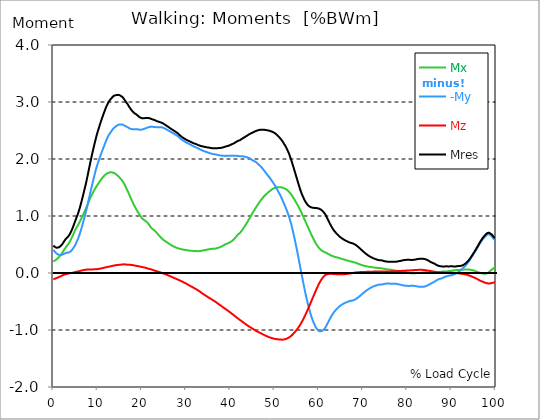
| Category |  Mx |  -My |  Mz |  Mres |
|---|---|---|---|---|
| 0.0 | 0.2 | 0.408 | -0.111 | 0.483 |
| 0.167348456675344 | 0.209 | 0.392 | -0.106 | 0.471 |
| 0.334696913350688 | 0.219 | 0.374 | -0.101 | 0.458 |
| 0.5020453700260321 | 0.227 | 0.359 | -0.096 | 0.449 |
| 0.669393826701376 | 0.237 | 0.346 | -0.09 | 0.444 |
| 0.83674228337672 | 0.246 | 0.334 | -0.085 | 0.443 |
| 1.0040907400520642 | 0.259 | 0.327 | -0.08 | 0.446 |
| 1.1621420602454444 | 0.272 | 0.321 | -0.074 | 0.448 |
| 1.3294905169207885 | 0.286 | 0.316 | -0.069 | 0.453 |
| 1.4968389735961325 | 0.301 | 0.316 | -0.062 | 0.464 |
| 1.6641874302714765 | 0.317 | 0.316 | -0.056 | 0.476 |
| 1.8315358869468206 | 0.334 | 0.317 | -0.051 | 0.489 |
| 1.9988843436221646 | 0.352 | 0.322 | -0.045 | 0.505 |
| 2.1662328002975086 | 0.374 | 0.327 | -0.039 | 0.523 |
| 2.333581256972853 | 0.395 | 0.333 | -0.033 | 0.544 |
| 2.5009297136481967 | 0.415 | 0.34 | -0.028 | 0.564 |
| 2.6682781703235405 | 0.434 | 0.346 | -0.023 | 0.583 |
| 2.8356266269988843 | 0.452 | 0.352 | -0.02 | 0.599 |
| 3.002975083674229 | 0.469 | 0.356 | -0.017 | 0.614 |
| 3.1703235403495724 | 0.486 | 0.358 | -0.013 | 0.626 |
| 3.337671997024917 | 0.502 | 0.358 | -0.01 | 0.638 |
| 3.4957233172182973 | 0.522 | 0.362 | -0.006 | 0.655 |
| 3.663071773893641 | 0.542 | 0.366 | -0.004 | 0.674 |
| 3.8304202305689854 | 0.567 | 0.377 | -0.001 | 0.699 |
| 3.997768687244329 | 0.592 | 0.387 | 0 | 0.725 |
| 4.165117143919673 | 0.619 | 0.401 | 0.002 | 0.755 |
| 4.332465600595017 | 0.648 | 0.416 | 0.004 | 0.786 |
| 4.499814057270361 | 0.676 | 0.435 | 0.007 | 0.82 |
| 4.667162513945706 | 0.706 | 0.456 | 0.011 | 0.856 |
| 4.834510970621049 | 0.735 | 0.477 | 0.014 | 0.891 |
| 5.001859427296393 | 0.762 | 0.501 | 0.018 | 0.926 |
| 5.169207883971737 | 0.787 | 0.529 | 0.021 | 0.96 |
| 5.336556340647081 | 0.809 | 0.557 | 0.023 | 0.994 |
| 5.503904797322425 | 0.831 | 0.586 | 0.027 | 1.028 |
| 5.671253253997769 | 0.854 | 0.619 | 0.029 | 1.065 |
| 5.82930457419115 | 0.878 | 0.656 | 0.032 | 1.106 |
| 5.996653030866494 | 0.904 | 0.694 | 0.035 | 1.15 |
| 6.164001487541838 | 0.931 | 0.736 | 0.038 | 1.196 |
| 6.331349944217181 | 0.958 | 0.778 | 0.042 | 1.245 |
| 6.498698400892526 | 0.986 | 0.823 | 0.046 | 1.295 |
| 6.66604685756787 | 1.014 | 0.87 | 0.049 | 1.347 |
| 6.833395314243213 | 1.041 | 0.919 | 0.05 | 1.399 |
| 7.000743770918558 | 1.069 | 0.968 | 0.053 | 1.453 |
| 7.168092227593902 | 1.098 | 1.017 | 0.055 | 1.506 |
| 7.335440684269246 | 1.127 | 1.066 | 0.057 | 1.561 |
| 7.50278914094459 | 1.158 | 1.118 | 0.058 | 1.619 |
| 7.6701375976199335 | 1.189 | 1.173 | 0.061 | 1.679 |
| 7.837486054295278 | 1.22 | 1.231 | 0.061 | 1.743 |
| 7.995537374488658 | 1.253 | 1.29 | 0.062 | 1.808 |
| 8.162885831164003 | 1.283 | 1.346 | 0.063 | 1.869 |
| 8.330234287839346 | 1.313 | 1.404 | 0.063 | 1.932 |
| 8.49758274451469 | 1.341 | 1.459 | 0.063 | 1.99 |
| 8.664931201190035 | 1.367 | 1.515 | 0.063 | 2.05 |
| 8.832279657865378 | 1.394 | 1.57 | 0.064 | 2.108 |
| 8.999628114540721 | 1.418 | 1.623 | 0.064 | 2.165 |
| 9.166976571216066 | 1.443 | 1.676 | 0.064 | 2.221 |
| 9.334325027891412 | 1.466 | 1.727 | 0.064 | 2.275 |
| 9.501673484566755 | 1.488 | 1.778 | 0.065 | 2.328 |
| 9.669021941242098 | 1.51 | 1.827 | 0.066 | 2.38 |
| 9.836370397917442 | 1.531 | 1.872 | 0.068 | 2.428 |
| 10.003718854592787 | 1.55 | 1.913 | 0.069 | 2.472 |
| 10.17106731126813 | 1.569 | 1.951 | 0.071 | 2.515 |
| 10.329118631461512 | 1.589 | 1.988 | 0.073 | 2.555 |
| 10.496467088136853 | 1.608 | 2.027 | 0.075 | 2.598 |
| 10.663815544812199 | 1.626 | 2.064 | 0.077 | 2.638 |
| 10.831164001487544 | 1.644 | 2.099 | 0.081 | 2.676 |
| 10.998512458162887 | 1.66 | 2.134 | 0.084 | 2.714 |
| 11.16586091483823 | 1.676 | 2.168 | 0.086 | 2.752 |
| 11.333209371513574 | 1.691 | 2.202 | 0.089 | 2.788 |
| 11.50055782818892 | 1.706 | 2.236 | 0.092 | 2.823 |
| 11.667906284864264 | 1.719 | 2.269 | 0.096 | 2.857 |
| 11.835254741539607 | 1.73 | 2.303 | 0.099 | 2.892 |
| 12.00260319821495 | 1.739 | 2.334 | 0.102 | 2.923 |
| 12.169951654890292 | 1.746 | 2.363 | 0.105 | 2.95 |
| 12.337300111565641 | 1.753 | 2.391 | 0.108 | 2.977 |
| 12.504648568240984 | 1.759 | 2.416 | 0.11 | 3.001 |
| 12.662699888434362 | 1.764 | 2.437 | 0.113 | 3.021 |
| 12.830048345109708 | 1.768 | 2.454 | 0.116 | 3.038 |
| 12.997396801785053 | 1.769 | 2.473 | 0.118 | 3.054 |
| 13.164745258460396 | 1.768 | 2.493 | 0.121 | 3.069 |
| 13.33209371513574 | 1.762 | 2.512 | 0.124 | 3.083 |
| 13.499442171811083 | 1.759 | 2.53 | 0.127 | 3.097 |
| 13.666790628486426 | 1.756 | 2.546 | 0.131 | 3.108 |
| 13.834139085161771 | 1.752 | 2.553 | 0.133 | 3.111 |
| 14.001487541837117 | 1.743 | 2.564 | 0.136 | 3.117 |
| 14.16883599851246 | 1.731 | 2.575 | 0.137 | 3.121 |
| 14.336184455187803 | 1.721 | 2.584 | 0.139 | 3.123 |
| 14.503532911863147 | 1.711 | 2.591 | 0.14 | 3.124 |
| 14.670881368538492 | 1.701 | 2.599 | 0.142 | 3.125 |
| 14.828932688731873 | 1.687 | 2.605 | 0.143 | 3.123 |
| 14.996281145407215 | 1.672 | 2.607 | 0.144 | 3.119 |
| 15.163629602082558 | 1.657 | 2.607 | 0.146 | 3.11 |
| 15.330978058757903 | 1.641 | 2.607 | 0.148 | 3.102 |
| 15.498326515433247 | 1.627 | 2.607 | 0.149 | 3.094 |
| 15.665674972108594 | 1.61 | 2.605 | 0.151 | 3.085 |
| 15.833023428783937 | 1.59 | 2.598 | 0.152 | 3.068 |
| 16.00037188545928 | 1.567 | 2.589 | 0.152 | 3.049 |
| 16.167720342134626 | 1.539 | 2.583 | 0.151 | 3.03 |
| 16.335068798809967 | 1.513 | 2.575 | 0.151 | 3.011 |
| 16.502417255485312 | 1.485 | 2.569 | 0.149 | 2.992 |
| 16.669765712160658 | 1.458 | 2.563 | 0.146 | 2.975 |
| 16.837114168836 | 1.431 | 2.557 | 0.145 | 2.958 |
| 17.004462625511344 | 1.404 | 2.546 | 0.144 | 2.934 |
| 17.16251394570472 | 1.376 | 2.538 | 0.144 | 2.913 |
| 17.32986240238007 | 1.344 | 2.535 | 0.143 | 2.895 |
| 17.497210859055414 | 1.314 | 2.529 | 0.142 | 2.874 |
| 17.664559315730756 | 1.288 | 2.525 | 0.141 | 2.859 |
| 17.8319077724061 | 1.26 | 2.522 | 0.139 | 2.842 |
| 17.999256229081443 | 1.231 | 2.521 | 0.137 | 2.828 |
| 18.166604685756788 | 1.203 | 2.52 | 0.135 | 2.814 |
| 18.333953142432133 | 1.177 | 2.521 | 0.132 | 2.804 |
| 18.501301599107478 | 1.153 | 2.522 | 0.128 | 2.795 |
| 18.668650055782823 | 1.13 | 2.523 | 0.126 | 2.787 |
| 18.835998512458165 | 1.107 | 2.524 | 0.123 | 2.778 |
| 19.00334696913351 | 1.083 | 2.523 | 0.122 | 2.766 |
| 19.170695425808855 | 1.061 | 2.52 | 0.119 | 2.755 |
| 19.338043882484197 | 1.042 | 2.515 | 0.117 | 2.743 |
| 19.496095202677576 | 1.023 | 2.512 | 0.115 | 2.732 |
| 19.66344365935292 | 1.003 | 2.51 | 0.111 | 2.722 |
| 19.830792116028263 | 0.984 | 2.515 | 0.109 | 2.721 |
| 19.998140572703612 | 0.965 | 2.514 | 0.106 | 2.713 |
| 20.165489029378953 | 0.951 | 2.519 | 0.103 | 2.714 |
| 20.3328374860543 | 0.939 | 2.523 | 0.1 | 2.715 |
| 20.500185942729644 | 0.93 | 2.528 | 0.097 | 2.715 |
| 20.667534399404985 | 0.921 | 2.532 | 0.094 | 2.717 |
| 20.83488285608033 | 0.913 | 2.537 | 0.091 | 2.719 |
| 21.002231312755672 | 0.902 | 2.542 | 0.088 | 2.72 |
| 21.16957976943102 | 0.891 | 2.549 | 0.084 | 2.722 |
| 21.336928226106362 | 0.879 | 2.553 | 0.08 | 2.723 |
| 21.504276682781704 | 0.864 | 2.556 | 0.075 | 2.72 |
| 21.67162513945705 | 0.845 | 2.561 | 0.072 | 2.715 |
| 21.82967645965043 | 0.826 | 2.565 | 0.068 | 2.712 |
| 21.997024916325774 | 0.806 | 2.567 | 0.066 | 2.707 |
| 22.16437337300112 | 0.79 | 2.568 | 0.062 | 2.703 |
| 22.33172182967646 | 0.777 | 2.567 | 0.057 | 2.697 |
| 22.499070286351806 | 0.766 | 2.564 | 0.054 | 2.692 |
| 22.666418743027148 | 0.758 | 2.563 | 0.049 | 2.689 |
| 22.833767199702496 | 0.747 | 2.563 | 0.044 | 2.686 |
| 23.00111565637784 | 0.737 | 2.559 | 0.039 | 2.679 |
| 23.168464113053183 | 0.723 | 2.558 | 0.035 | 2.673 |
| 23.335812569728528 | 0.708 | 2.557 | 0.032 | 2.668 |
| 23.50316102640387 | 0.693 | 2.555 | 0.028 | 2.661 |
| 23.670509483079215 | 0.678 | 2.554 | 0.023 | 2.655 |
| 23.83785793975456 | 0.663 | 2.556 | 0.02 | 2.653 |
| 23.995909259947936 | 0.649 | 2.557 | 0.016 | 2.65 |
| 24.163257716623285 | 0.636 | 2.556 | 0.012 | 2.644 |
| 24.330606173298627 | 0.621 | 2.556 | 0.007 | 2.64 |
| 24.49795462997397 | 0.607 | 2.556 | 0.003 | 2.636 |
| 24.665303086649313 | 0.596 | 2.553 | -0.002 | 2.63 |
| 24.83265154332466 | 0.585 | 2.549 | -0.006 | 2.623 |
| 25.0 | 0.574 | 2.541 | -0.012 | 2.614 |
| 25.167348456675345 | 0.564 | 2.536 | -0.017 | 2.606 |
| 25.334696913350694 | 0.555 | 2.529 | -0.021 | 2.597 |
| 25.502045370026035 | 0.547 | 2.522 | -0.027 | 2.588 |
| 25.669393826701377 | 0.539 | 2.514 | -0.031 | 2.58 |
| 25.836742283376722 | 0.531 | 2.507 | -0.036 | 2.571 |
| 26.004090740052067 | 0.521 | 2.501 | -0.042 | 2.563 |
| 26.17143919672741 | 0.512 | 2.493 | -0.048 | 2.553 |
| 26.329490516920792 | 0.503 | 2.484 | -0.053 | 2.542 |
| 26.49683897359613 | 0.495 | 2.478 | -0.059 | 2.534 |
| 26.66418743027148 | 0.487 | 2.47 | -0.065 | 2.527 |
| 26.831535886946828 | 0.48 | 2.464 | -0.07 | 2.518 |
| 26.998884343622166 | 0.473 | 2.456 | -0.076 | 2.511 |
| 27.166232800297514 | 0.466 | 2.449 | -0.082 | 2.502 |
| 27.333581256972852 | 0.461 | 2.441 | -0.088 | 2.493 |
| 27.5009297136482 | 0.455 | 2.432 | -0.093 | 2.484 |
| 27.668278170323543 | 0.449 | 2.424 | -0.099 | 2.475 |
| 27.835626626998888 | 0.444 | 2.417 | -0.105 | 2.467 |
| 28.002975083674233 | 0.438 | 2.41 | -0.11 | 2.459 |
| 28.170323540349575 | 0.434 | 2.4 | -0.116 | 2.449 |
| 28.33767199702492 | 0.43 | 2.39 | -0.122 | 2.437 |
| 28.50502045370026 | 0.426 | 2.375 | -0.127 | 2.424 |
| 28.663071773893645 | 0.424 | 2.363 | -0.133 | 2.411 |
| 28.830420230568986 | 0.419 | 2.351 | -0.139 | 2.4 |
| 28.99776868724433 | 0.416 | 2.342 | -0.145 | 2.39 |
| 29.165117143919673 | 0.414 | 2.333 | -0.152 | 2.381 |
| 29.33246560059502 | 0.411 | 2.325 | -0.158 | 2.373 |
| 29.499814057270367 | 0.408 | 2.315 | -0.165 | 2.364 |
| 29.66716251394571 | 0.406 | 2.308 | -0.171 | 2.356 |
| 29.834510970621054 | 0.403 | 2.299 | -0.177 | 2.348 |
| 30.00185942729639 | 0.401 | 2.292 | -0.184 | 2.341 |
| 30.169207883971744 | 0.4 | 2.285 | -0.191 | 2.333 |
| 30.33655634064708 | 0.398 | 2.277 | -0.2 | 2.326 |
| 30.50390479732243 | 0.396 | 2.271 | -0.207 | 2.321 |
| 30.671253253997772 | 0.394 | 2.265 | -0.214 | 2.315 |
| 30.829304574191156 | 0.392 | 2.259 | -0.222 | 2.31 |
| 30.996653030866494 | 0.391 | 2.253 | -0.228 | 2.303 |
| 31.164001487541842 | 0.39 | 2.245 | -0.237 | 2.296 |
| 31.331349944217187 | 0.389 | 2.237 | -0.243 | 2.29 |
| 31.498698400892525 | 0.389 | 2.229 | -0.251 | 2.283 |
| 31.666046857567874 | 0.387 | 2.223 | -0.257 | 2.278 |
| 31.833395314243212 | 0.386 | 2.218 | -0.264 | 2.273 |
| 32.00074377091856 | 0.385 | 2.212 | -0.273 | 2.269 |
| 32.1680922275939 | 0.385 | 2.207 | -0.28 | 2.264 |
| 32.33544068426925 | 0.384 | 2.201 | -0.287 | 2.259 |
| 32.50278914094459 | 0.383 | 2.194 | -0.294 | 2.254 |
| 32.670137597619934 | 0.382 | 2.188 | -0.303 | 2.248 |
| 32.83748605429528 | 0.383 | 2.18 | -0.311 | 2.242 |
| 33.004834510970625 | 0.384 | 2.174 | -0.321 | 2.237 |
| 33.162885831164004 | 0.385 | 2.168 | -0.329 | 2.232 |
| 33.33023428783935 | 0.386 | 2.161 | -0.338 | 2.228 |
| 33.497582744514695 | 0.389 | 2.156 | -0.347 | 2.225 |
| 33.664931201190036 | 0.394 | 2.151 | -0.358 | 2.222 |
| 33.83227965786538 | 0.396 | 2.145 | -0.366 | 2.22 |
| 33.99962811454073 | 0.398 | 2.141 | -0.375 | 2.217 |
| 34.16697657121607 | 0.4 | 2.135 | -0.383 | 2.213 |
| 34.33432502789141 | 0.403 | 2.13 | -0.391 | 2.21 |
| 34.50167348456676 | 0.406 | 2.125 | -0.399 | 2.208 |
| 34.6690219412421 | 0.409 | 2.12 | -0.408 | 2.205 |
| 34.83637039791744 | 0.412 | 2.117 | -0.416 | 2.204 |
| 35.00371885459279 | 0.414 | 2.113 | -0.426 | 2.203 |
| 35.17106731126814 | 0.416 | 2.108 | -0.433 | 2.2 |
| 35.338415767943474 | 0.418 | 2.104 | -0.442 | 2.197 |
| 35.49646708813686 | 0.42 | 2.1 | -0.449 | 2.195 |
| 35.6638155448122 | 0.423 | 2.096 | -0.456 | 2.193 |
| 35.831164001487544 | 0.425 | 2.091 | -0.465 | 2.19 |
| 35.998512458162885 | 0.426 | 2.088 | -0.472 | 2.189 |
| 36.165860914838234 | 0.426 | 2.086 | -0.481 | 2.188 |
| 36.333209371513576 | 0.426 | 2.084 | -0.488 | 2.189 |
| 36.50055782818892 | 0.427 | 2.082 | -0.497 | 2.188 |
| 36.667906284864266 | 0.43 | 2.08 | -0.505 | 2.189 |
| 36.83525474153961 | 0.433 | 2.077 | -0.515 | 2.189 |
| 37.002603198214956 | 0.436 | 2.073 | -0.524 | 2.189 |
| 37.1699516548903 | 0.441 | 2.071 | -0.534 | 2.19 |
| 37.337300111565646 | 0.445 | 2.069 | -0.544 | 2.191 |
| 37.50464856824098 | 0.449 | 2.066 | -0.552 | 2.192 |
| 37.66269988843437 | 0.453 | 2.064 | -0.562 | 2.193 |
| 37.83004834510971 | 0.458 | 2.062 | -0.57 | 2.194 |
| 37.99739680178505 | 0.464 | 2.059 | -0.58 | 2.196 |
| 38.16474525846039 | 0.47 | 2.057 | -0.59 | 2.2 |
| 38.33209371513574 | 0.478 | 2.056 | -0.6 | 2.203 |
| 38.49944217181109 | 0.486 | 2.055 | -0.608 | 2.207 |
| 38.666790628486424 | 0.494 | 2.055 | -0.618 | 2.211 |
| 38.83413908516178 | 0.5 | 2.054 | -0.627 | 2.215 |
| 39.001487541837115 | 0.507 | 2.054 | -0.636 | 2.22 |
| 39.16883599851246 | 0.512 | 2.056 | -0.645 | 2.224 |
| 39.336184455187805 | 0.517 | 2.055 | -0.654 | 2.227 |
| 39.503532911863154 | 0.522 | 2.055 | -0.663 | 2.23 |
| 39.670881368538495 | 0.529 | 2.054 | -0.673 | 2.235 |
| 39.83822982521384 | 0.535 | 2.056 | -0.683 | 2.24 |
| 39.996281145407224 | 0.541 | 2.057 | -0.692 | 2.246 |
| 40.163629602082565 | 0.549 | 2.057 | -0.703 | 2.252 |
| 40.33097805875791 | 0.558 | 2.057 | -0.713 | 2.258 |
| 40.498326515433256 | 0.569 | 2.059 | -0.723 | 2.264 |
| 40.6656749721086 | 0.58 | 2.059 | -0.732 | 2.271 |
| 40.83302342878393 | 0.592 | 2.057 | -0.743 | 2.276 |
| 41.00037188545929 | 0.606 | 2.057 | -0.754 | 2.283 |
| 41.16772034213463 | 0.621 | 2.057 | -0.764 | 2.291 |
| 41.33506879880997 | 0.638 | 2.056 | -0.774 | 2.299 |
| 41.50241725548531 | 0.655 | 2.055 | -0.783 | 2.308 |
| 41.66976571216066 | 0.669 | 2.054 | -0.794 | 2.314 |
| 41.837114168836 | 0.682 | 2.052 | -0.804 | 2.321 |
| 42.004462625511344 | 0.692 | 2.051 | -0.813 | 2.325 |
| 42.17181108218669 | 0.703 | 2.049 | -0.823 | 2.33 |
| 42.32986240238007 | 0.717 | 2.048 | -0.832 | 2.337 |
| 42.497210859055414 | 0.734 | 2.048 | -0.842 | 2.346 |
| 42.66455931573076 | 0.752 | 2.049 | -0.851 | 2.356 |
| 42.831907772406105 | 0.771 | 2.048 | -0.861 | 2.364 |
| 42.999256229081446 | 0.789 | 2.046 | -0.87 | 2.372 |
| 43.16660468575679 | 0.808 | 2.044 | -0.88 | 2.379 |
| 43.33395314243214 | 0.827 | 2.041 | -0.89 | 2.387 |
| 43.50130159910748 | 0.847 | 2.037 | -0.899 | 2.395 |
| 43.66865005578282 | 0.868 | 2.034 | -0.908 | 2.403 |
| 43.83599851245817 | 0.89 | 2.029 | -0.916 | 2.411 |
| 44.00334696913351 | 0.912 | 2.023 | -0.926 | 2.419 |
| 44.17069542580886 | 0.935 | 2.019 | -0.934 | 2.428 |
| 44.3380438824842 | 0.958 | 2.014 | -0.943 | 2.436 |
| 44.49609520267758 | 0.98 | 2.007 | -0.951 | 2.444 |
| 44.66344365935292 | 1.002 | 1.998 | -0.959 | 2.449 |
| 44.83079211602827 | 1.025 | 1.987 | -0.966 | 2.454 |
| 44.99814057270361 | 1.049 | 1.979 | -0.975 | 2.462 |
| 45.16548902937895 | 1.069 | 1.972 | -0.982 | 2.468 |
| 45.332837486054295 | 1.09 | 1.967 | -0.99 | 2.475 |
| 45.500185942729644 | 1.111 | 1.961 | -0.999 | 2.481 |
| 45.66753439940499 | 1.133 | 1.952 | -1.007 | 2.487 |
| 45.83488285608033 | 1.152 | 1.944 | -1.015 | 2.493 |
| 46.00223131275568 | 1.172 | 1.933 | -1.022 | 2.497 |
| 46.16957976943102 | 1.193 | 1.921 | -1.03 | 2.502 |
| 46.336928226106366 | 1.213 | 1.91 | -1.036 | 2.505 |
| 46.50427668278171 | 1.231 | 1.897 | -1.044 | 2.508 |
| 46.671625139457056 | 1.251 | 1.885 | -1.049 | 2.511 |
| 46.829676459650436 | 1.269 | 1.874 | -1.055 | 2.514 |
| 46.99702491632577 | 1.285 | 1.861 | -1.062 | 2.515 |
| 47.16437337300112 | 1.3 | 1.845 | -1.069 | 2.515 |
| 47.33172182967646 | 1.317 | 1.829 | -1.075 | 2.515 |
| 47.49907028635181 | 1.334 | 1.812 | -1.082 | 2.515 |
| 47.66641874302716 | 1.348 | 1.795 | -1.088 | 2.513 |
| 47.83376719970249 | 1.361 | 1.778 | -1.094 | 2.511 |
| 48.001115656377834 | 1.374 | 1.761 | -1.1 | 2.508 |
| 48.16846411305319 | 1.385 | 1.744 | -1.106 | 2.506 |
| 48.33581256972853 | 1.398 | 1.727 | -1.111 | 2.503 |
| 48.50316102640387 | 1.41 | 1.71 | -1.117 | 2.501 |
| 48.67050948307921 | 1.421 | 1.695 | -1.122 | 2.499 |
| 48.837857939754564 | 1.431 | 1.68 | -1.128 | 2.496 |
| 49.005206396429905 | 1.441 | 1.662 | -1.133 | 2.492 |
| 49.163257716623285 | 1.45 | 1.644 | -1.137 | 2.487 |
| 49.33060617329863 | 1.463 | 1.625 | -1.14 | 2.484 |
| 49.49795462997397 | 1.472 | 1.605 | -1.144 | 2.479 |
| 49.66530308664932 | 1.48 | 1.585 | -1.148 | 2.472 |
| 49.832651543324666 | 1.485 | 1.567 | -1.15 | 2.465 |
| 50.0 | 1.489 | 1.547 | -1.154 | 2.456 |
| 50.16734845667534 | 1.496 | 1.527 | -1.157 | 2.449 |
| 50.33469691335069 | 1.499 | 1.504 | -1.159 | 2.438 |
| 50.50204537002604 | 1.501 | 1.481 | -1.161 | 2.427 |
| 50.66939382670139 | 1.503 | 1.458 | -1.162 | 2.414 |
| 50.836742283376715 | 1.504 | 1.432 | -1.163 | 2.401 |
| 51.00409074005207 | 1.505 | 1.408 | -1.166 | 2.387 |
| 51.17143919672741 | 1.504 | 1.383 | -1.167 | 2.374 |
| 51.32949051692079 | 1.504 | 1.358 | -1.168 | 2.359 |
| 51.496838973596134 | 1.503 | 1.331 | -1.169 | 2.343 |
| 51.66418743027148 | 1.5 | 1.305 | -1.17 | 2.327 |
| 51.831535886946824 | 1.497 | 1.274 | -1.17 | 2.307 |
| 51.99888434362217 | 1.492 | 1.244 | -1.168 | 2.287 |
| 52.16623280029752 | 1.486 | 1.214 | -1.166 | 2.265 |
| 52.33358125697285 | 1.481 | 1.186 | -1.163 | 2.245 |
| 52.5009297136482 | 1.475 | 1.155 | -1.16 | 2.223 |
| 52.668278170323546 | 1.466 | 1.121 | -1.155 | 2.199 |
| 52.835626626998895 | 1.458 | 1.087 | -1.149 | 2.171 |
| 53.00297508367424 | 1.447 | 1.052 | -1.143 | 2.143 |
| 53.17032354034958 | 1.434 | 1.016 | -1.136 | 2.114 |
| 53.33767199702492 | 1.42 | 0.978 | -1.128 | 2.083 |
| 53.50502045370027 | 1.406 | 0.932 | -1.12 | 2.046 |
| 53.663071773893655 | 1.389 | 0.886 | -1.11 | 2.008 |
| 53.83042023056899 | 1.372 | 0.84 | -1.1 | 1.971 |
| 53.99776868724433 | 1.351 | 0.788 | -1.087 | 1.929 |
| 54.16511714391967 | 1.331 | 0.732 | -1.073 | 1.887 |
| 54.33246560059503 | 1.31 | 0.674 | -1.059 | 1.846 |
| 54.49981405727037 | 1.29 | 0.616 | -1.046 | 1.803 |
| 54.667162513945705 | 1.269 | 0.555 | -1.03 | 1.759 |
| 54.834510970621054 | 1.246 | 0.495 | -1.015 | 1.715 |
| 55.0018594272964 | 1.224 | 0.432 | -0.999 | 1.672 |
| 55.169207883971744 | 1.201 | 0.367 | -0.982 | 1.628 |
| 55.336556340647086 | 1.176 | 0.3 | -0.965 | 1.584 |
| 55.50390479732243 | 1.151 | 0.232 | -0.946 | 1.542 |
| 55.671253253997776 | 1.126 | 0.163 | -0.926 | 1.5 |
| 55.83860171067312 | 1.1 | 0.096 | -0.904 | 1.46 |
| 55.9966530308665 | 1.073 | 0.029 | -0.882 | 1.423 |
| 56.16400148754184 | 1.046 | -0.037 | -0.86 | 1.389 |
| 56.33134994421718 | 1.018 | -0.103 | -0.835 | 1.358 |
| 56.498698400892536 | 0.99 | -0.169 | -0.811 | 1.329 |
| 56.66604685756788 | 0.962 | -0.234 | -0.786 | 1.3 |
| 56.83339531424321 | 0.933 | -0.297 | -0.759 | 1.274 |
| 57.00074377091856 | 0.903 | -0.36 | -0.731 | 1.251 |
| 57.16809222759391 | 0.874 | -0.418 | -0.704 | 1.23 |
| 57.33544068426925 | 0.844 | -0.472 | -0.675 | 1.211 |
| 57.5027891409446 | 0.814 | -0.527 | -0.646 | 1.194 |
| 57.670137597619934 | 0.786 | -0.58 | -0.618 | 1.182 |
| 57.83748605429528 | 0.756 | -0.628 | -0.587 | 1.172 |
| 58.004834510970625 | 0.728 | -0.675 | -0.556 | 1.162 |
| 58.16288583116401 | 0.701 | -0.72 | -0.525 | 1.157 |
| 58.330234287839346 | 0.673 | -0.762 | -0.494 | 1.152 |
| 58.497582744514695 | 0.646 | -0.8 | -0.463 | 1.146 |
| 58.66493120119004 | 0.62 | -0.835 | -0.433 | 1.143 |
| 58.832279657865385 | 0.594 | -0.868 | -0.402 | 1.143 |
| 58.999628114540734 | 0.57 | -0.898 | -0.372 | 1.142 |
| 59.16697657121607 | 0.546 | -0.926 | -0.342 | 1.142 |
| 59.33432502789142 | 0.522 | -0.951 | -0.311 | 1.141 |
| 59.50167348456676 | 0.5 | -0.972 | -0.281 | 1.14 |
| 59.66902194124211 | 0.48 | -0.989 | -0.253 | 1.137 |
| 59.83637039791745 | 0.463 | -1.003 | -0.226 | 1.135 |
| 60.00371885459278 | 0.446 | -1.014 | -0.2 | 1.132 |
| 60.17106731126813 | 0.43 | -1.021 | -0.174 | 1.127 |
| 60.33841576794349 | 0.416 | -1.024 | -0.15 | 1.12 |
| 60.49646708813685 | 0.404 | -1.023 | -0.128 | 1.111 |
| 60.6638155448122 | 0.395 | -1.019 | -0.108 | 1.102 |
| 60.831164001487544 | 0.386 | -1.012 | -0.09 | 1.089 |
| 60.99851245816289 | 0.379 | -1.002 | -0.073 | 1.076 |
| 61.16586091483824 | 0.373 | -0.992 | -0.057 | 1.063 |
| 61.333209371513576 | 0.366 | -0.978 | -0.045 | 1.047 |
| 61.50055782818892 | 0.36 | -0.959 | -0.035 | 1.025 |
| 61.667906284864266 | 0.354 | -0.933 | -0.03 | 1 |
| 61.835254741539615 | 0.347 | -0.91 | -0.023 | 0.975 |
| 62.002603198214956 | 0.341 | -0.885 | -0.02 | 0.949 |
| 62.16995165489029 | 0.333 | -0.86 | -0.018 | 0.923 |
| 62.33730011156564 | 0.326 | -0.833 | -0.016 | 0.896 |
| 62.504648568240995 | 0.318 | -0.809 | -0.015 | 0.869 |
| 62.67199702491633 | 0.312 | -0.785 | -0.014 | 0.845 |
| 62.83004834510971 | 0.306 | -0.761 | -0.015 | 0.821 |
| 62.99739680178505 | 0.301 | -0.74 | -0.015 | 0.799 |
| 63.1647452584604 | 0.296 | -0.719 | -0.016 | 0.778 |
| 63.33209371513575 | 0.291 | -0.7 | -0.016 | 0.758 |
| 63.4994421718111 | 0.287 | -0.682 | -0.017 | 0.74 |
| 63.666790628486424 | 0.282 | -0.667 | -0.018 | 0.724 |
| 63.83413908516177 | 0.279 | -0.651 | -0.02 | 0.709 |
| 64.00148754183712 | 0.276 | -0.636 | -0.021 | 0.693 |
| 64.16883599851248 | 0.272 | -0.623 | -0.021 | 0.68 |
| 64.3361844551878 | 0.269 | -0.61 | -0.022 | 0.668 |
| 64.50353291186315 | 0.264 | -0.599 | -0.023 | 0.655 |
| 64.6708813685385 | 0.261 | -0.587 | -0.023 | 0.643 |
| 64.83822982521384 | 0.257 | -0.576 | -0.023 | 0.632 |
| 65.00557828188919 | 0.253 | -0.567 | -0.023 | 0.621 |
| 65.16362960208257 | 0.249 | -0.558 | -0.023 | 0.613 |
| 65.3309780587579 | 0.245 | -0.55 | -0.022 | 0.603 |
| 65.49832651543326 | 0.242 | -0.542 | -0.022 | 0.594 |
| 65.6656749721086 | 0.238 | -0.536 | -0.021 | 0.587 |
| 65.83302342878395 | 0.234 | -0.529 | -0.021 | 0.579 |
| 66.00037188545929 | 0.229 | -0.523 | -0.019 | 0.571 |
| 66.16772034213463 | 0.225 | -0.518 | -0.018 | 0.565 |
| 66.33506879880998 | 0.222 | -0.512 | -0.016 | 0.558 |
| 66.50241725548531 | 0.218 | -0.506 | -0.015 | 0.552 |
| 66.66976571216065 | 0.214 | -0.502 | -0.013 | 0.546 |
| 66.83711416883601 | 0.21 | -0.497 | -0.011 | 0.54 |
| 67.00446262551135 | 0.207 | -0.493 | -0.008 | 0.535 |
| 67.1718110821867 | 0.204 | -0.488 | -0.006 | 0.53 |
| 67.32986240238007 | 0.201 | -0.486 | -0.003 | 0.527 |
| 67.49721085905541 | 0.199 | -0.485 | -0.001 | 0.524 |
| 67.66455931573076 | 0.195 | -0.482 | 0.001 | 0.52 |
| 67.83190777240611 | 0.191 | -0.478 | 0.003 | 0.515 |
| 67.99925622908145 | 0.188 | -0.472 | 0.005 | 0.508 |
| 68.16660468575678 | 0.184 | -0.467 | 0.007 | 0.502 |
| 68.33395314243214 | 0.179 | -0.46 | 0.008 | 0.495 |
| 68.50130159910749 | 0.175 | -0.452 | 0.011 | 0.485 |
| 68.66865005578282 | 0.17 | -0.443 | 0.012 | 0.476 |
| 68.83599851245816 | 0.165 | -0.433 | 0.013 | 0.464 |
| 69.00334696913352 | 0.16 | -0.424 | 0.014 | 0.453 |
| 69.17069542580886 | 0.155 | -0.413 | 0.015 | 0.442 |
| 69.3380438824842 | 0.15 | -0.401 | 0.016 | 0.43 |
| 69.50539233915956 | 0.145 | -0.391 | 0.016 | 0.417 |
| 69.66344365935292 | 0.141 | -0.379 | 0.017 | 0.406 |
| 69.83079211602826 | 0.137 | -0.368 | 0.017 | 0.394 |
| 69.99814057270362 | 0.134 | -0.357 | 0.018 | 0.382 |
| 70.16548902937896 | 0.13 | -0.346 | 0.018 | 0.37 |
| 70.33283748605429 | 0.126 | -0.335 | 0.019 | 0.359 |
| 70.50018594272964 | 0.123 | -0.324 | 0.019 | 0.348 |
| 70.667534399405 | 0.12 | -0.314 | 0.02 | 0.338 |
| 70.83488285608033 | 0.118 | -0.305 | 0.02 | 0.328 |
| 71.00223131275568 | 0.115 | -0.295 | 0.02 | 0.317 |
| 71.16957976943102 | 0.111 | -0.287 | 0.021 | 0.309 |
| 71.33692822610637 | 0.109 | -0.277 | 0.021 | 0.299 |
| 71.50427668278171 | 0.107 | -0.271 | 0.021 | 0.293 |
| 71.67162513945706 | 0.105 | -0.263 | 0.022 | 0.286 |
| 71.8389735961324 | 0.103 | -0.256 | 0.022 | 0.277 |
| 71.99702491632577 | 0.102 | -0.248 | 0.023 | 0.271 |
| 72.16437337300113 | 0.1 | -0.242 | 0.023 | 0.264 |
| 72.33172182967647 | 0.099 | -0.237 | 0.024 | 0.259 |
| 72.49907028635181 | 0.097 | -0.232 | 0.025 | 0.254 |
| 72.66641874302715 | 0.096 | -0.227 | 0.025 | 0.249 |
| 72.8337671997025 | 0.093 | -0.223 | 0.025 | 0.244 |
| 73.00111565637783 | 0.091 | -0.218 | 0.025 | 0.239 |
| 73.16846411305319 | 0.09 | -0.213 | 0.025 | 0.235 |
| 73.33581256972853 | 0.089 | -0.209 | 0.025 | 0.23 |
| 73.50316102640387 | 0.088 | -0.206 | 0.025 | 0.227 |
| 73.67050948307921 | 0.087 | -0.204 | 0.027 | 0.224 |
| 73.83785793975457 | 0.086 | -0.203 | 0.027 | 0.224 |
| 74.00520639642991 | 0.085 | -0.203 | 0.028 | 0.223 |
| 74.16325771662328 | 0.083 | -0.203 | 0.028 | 0.222 |
| 74.33060617329863 | 0.081 | -0.201 | 0.027 | 0.22 |
| 74.49795462997398 | 0.079 | -0.199 | 0.028 | 0.217 |
| 74.66530308664932 | 0.076 | -0.195 | 0.028 | 0.213 |
| 74.83265154332466 | 0.073 | -0.191 | 0.028 | 0.208 |
| 75.00000000000001 | 0.07 | -0.188 | 0.028 | 0.205 |
| 75.16734845667534 | 0.068 | -0.187 | 0.028 | 0.203 |
| 75.3346969133507 | 0.066 | -0.186 | 0.028 | 0.201 |
| 75.50204537002605 | 0.064 | -0.186 | 0.028 | 0.2 |
| 75.66939382670138 | 0.063 | -0.185 | 0.028 | 0.199 |
| 75.83674228337672 | 0.061 | -0.185 | 0.028 | 0.199 |
| 76.00409074005208 | 0.059 | -0.186 | 0.029 | 0.199 |
| 76.17143919672742 | 0.058 | -0.187 | 0.029 | 0.2 |
| 76.33878765340276 | 0.056 | -0.187 | 0.029 | 0.199 |
| 76.49683897359614 | 0.054 | -0.187 | 0.029 | 0.199 |
| 76.66418743027148 | 0.052 | -0.187 | 0.029 | 0.197 |
| 76.83153588694682 | 0.05 | -0.187 | 0.03 | 0.197 |
| 76.99888434362218 | 0.048 | -0.188 | 0.03 | 0.197 |
| 77.16623280029752 | 0.045 | -0.187 | 0.031 | 0.197 |
| 77.33358125697285 | 0.042 | -0.188 | 0.031 | 0.197 |
| 77.5009297136482 | 0.04 | -0.189 | 0.032 | 0.197 |
| 77.66827817032356 | 0.039 | -0.192 | 0.033 | 0.201 |
| 77.83562662699889 | 0.038 | -0.195 | 0.033 | 0.203 |
| 78.00297508367423 | 0.037 | -0.197 | 0.034 | 0.206 |
| 78.17032354034959 | 0.035 | -0.201 | 0.035 | 0.208 |
| 78.33767199702493 | 0.033 | -0.203 | 0.036 | 0.21 |
| 78.50502045370027 | 0.032 | -0.206 | 0.036 | 0.212 |
| 78.67236891037561 | 0.032 | -0.209 | 0.037 | 0.217 |
| 78.83042023056899 | 0.03 | -0.212 | 0.038 | 0.22 |
| 78.99776868724433 | 0.028 | -0.215 | 0.039 | 0.222 |
| 79.16511714391969 | 0.027 | -0.218 | 0.04 | 0.224 |
| 79.33246560059503 | 0.024 | -0.22 | 0.04 | 0.226 |
| 79.49981405727036 | 0.022 | -0.223 | 0.041 | 0.228 |
| 79.66716251394571 | 0.019 | -0.225 | 0.042 | 0.23 |
| 79.83451097062107 | 0.015 | -0.225 | 0.042 | 0.23 |
| 80.00185942729641 | 0.012 | -0.225 | 0.044 | 0.23 |
| 80.16920788397174 | 0.008 | -0.226 | 0.044 | 0.23 |
| 80.33655634064709 | 0.004 | -0.226 | 0.045 | 0.231 |
| 80.50390479732243 | 0.002 | -0.226 | 0.045 | 0.231 |
| 80.67125325399778 | -0.001 | -0.225 | 0.046 | 0.23 |
| 80.83860171067312 | -0.003 | -0.224 | 0.047 | 0.229 |
| 80.99665303086651 | -0.004 | -0.224 | 0.048 | 0.229 |
| 81.16400148754184 | -0.005 | -0.223 | 0.049 | 0.229 |
| 81.3313499442172 | -0.005 | -0.224 | 0.049 | 0.23 |
| 81.49869840089255 | -0.004 | -0.225 | 0.05 | 0.231 |
| 81.66604685756786 | -0.003 | -0.227 | 0.051 | 0.234 |
| 81.83339531424322 | -0.003 | -0.228 | 0.052 | 0.236 |
| 82.00074377091858 | -0.002 | -0.23 | 0.052 | 0.238 |
| 82.16809222759392 | -0.001 | -0.234 | 0.053 | 0.241 |
| 82.33544068426926 | -0.001 | -0.237 | 0.054 | 0.244 |
| 82.50278914094459 | 0 | -0.239 | 0.055 | 0.246 |
| 82.67013759761994 | 0.001 | -0.241 | 0.055 | 0.248 |
| 82.83748605429528 | 0.003 | -0.242 | 0.056 | 0.249 |
| 83.00483451097062 | 0.003 | -0.242 | 0.056 | 0.249 |
| 83.17218296764597 | 0.005 | -0.242 | 0.056 | 0.249 |
| 83.33023428783935 | 0.006 | -0.242 | 0.055 | 0.249 |
| 83.4975827445147 | 0.007 | -0.243 | 0.055 | 0.251 |
| 83.66493120119004 | 0.008 | -0.242 | 0.054 | 0.249 |
| 83.83227965786537 | 0.011 | -0.24 | 0.052 | 0.246 |
| 83.99962811454073 | 0.011 | -0.237 | 0.051 | 0.244 |
| 84.16697657121607 | 0.012 | -0.232 | 0.049 | 0.24 |
| 84.33432502789142 | 0.012 | -0.228 | 0.047 | 0.236 |
| 84.50167348456677 | 0.012 | -0.222 | 0.045 | 0.229 |
| 84.6690219412421 | 0.011 | -0.217 | 0.042 | 0.224 |
| 84.83637039791745 | 0.011 | -0.209 | 0.04 | 0.217 |
| 85.0037188545928 | 0.011 | -0.202 | 0.038 | 0.208 |
| 85.17106731126813 | 0.01 | -0.194 | 0.036 | 0.2 |
| 85.33841576794349 | 0.011 | -0.187 | 0.033 | 0.193 |
| 85.50576422461883 | 0.011 | -0.18 | 0.031 | 0.187 |
| 85.66381554481221 | 0.01 | -0.173 | 0.029 | 0.18 |
| 85.83116400148755 | 0.01 | -0.167 | 0.027 | 0.174 |
| 85.99851245816289 | 0.008 | -0.159 | 0.024 | 0.169 |
| 86.16586091483823 | 0.008 | -0.153 | 0.022 | 0.165 |
| 86.33320937151358 | 0.008 | -0.144 | 0.02 | 0.157 |
| 86.50055782818893 | 0.007 | -0.135 | 0.018 | 0.148 |
| 86.66790628486427 | 0.008 | -0.126 | 0.016 | 0.139 |
| 86.83525474153961 | 0.011 | -0.119 | 0.014 | 0.134 |
| 87.00260319821496 | 0.012 | -0.113 | 0.013 | 0.128 |
| 87.16995165489031 | 0.014 | -0.107 | 0.012 | 0.124 |
| 87.33730011156564 | 0.016 | -0.102 | 0.012 | 0.12 |
| 87.504648568241 | 0.018 | -0.1 | 0.011 | 0.119 |
| 87.67199702491634 | 0.021 | -0.098 | 0.01 | 0.118 |
| 87.83004834510972 | 0.023 | -0.093 | 0.01 | 0.116 |
| 87.99739680178506 | 0.024 | -0.088 | 0.008 | 0.113 |
| 88.1647452584604 | 0.025 | -0.082 | 0.007 | 0.111 |
| 88.33209371513574 | 0.025 | -0.074 | 0.006 | 0.111 |
| 88.49944217181108 | 0.025 | -0.068 | 0.006 | 0.115 |
| 88.66679062848644 | 0.025 | -0.062 | 0.006 | 0.117 |
| 88.83413908516178 | 0.027 | -0.059 | 0.006 | 0.119 |
| 89.00148754183712 | 0.028 | -0.056 | 0.006 | 0.118 |
| 89.16883599851246 | 0.029 | -0.053 | 0.005 | 0.116 |
| 89.33618445518782 | 0.031 | -0.05 | 0.005 | 0.116 |
| 89.50353291186315 | 0.033 | -0.046 | 0.005 | 0.116 |
| 89.6708813685385 | 0.035 | -0.042 | 0.005 | 0.116 |
| 89.83822982521386 | 0.038 | -0.039 | 0.005 | 0.117 |
| 90.00557828188919 | 0.04 | -0.037 | 0.005 | 0.117 |
| 90.16362960208257 | 0.042 | -0.036 | 0.004 | 0.117 |
| 90.3309780587579 | 0.045 | -0.033 | 0.004 | 0.116 |
| 90.49832651543326 | 0.047 | -0.028 | 0.003 | 0.116 |
| 90.66567497210859 | 0.048 | -0.022 | 0.002 | 0.115 |
| 90.83302342878395 | 0.049 | -0.018 | 0.001 | 0.115 |
| 91.00037188545929 | 0.05 | -0.012 | 0 | 0.116 |
| 91.16772034213463 | 0.051 | -0.004 | -0.001 | 0.117 |
| 91.33506879880998 | 0.052 | 0.003 | -0.002 | 0.119 |
| 91.50241725548533 | 0.053 | 0.012 | -0.004 | 0.121 |
| 91.66976571216065 | 0.054 | 0.021 | -0.005 | 0.12 |
| 91.83711416883601 | 0.054 | 0.031 | -0.007 | 0.121 |
| 92.00446262551137 | 0.055 | 0.041 | -0.01 | 0.123 |
| 92.1718110821867 | 0.055 | 0.053 | -0.012 | 0.126 |
| 92.33915953886203 | 0.056 | 0.066 | -0.013 | 0.128 |
| 92.49721085905541 | 0.056 | 0.079 | -0.015 | 0.134 |
| 92.66455931573077 | 0.058 | 0.09 | -0.017 | 0.14 |
| 92.83190777240611 | 0.059 | 0.102 | -0.019 | 0.148 |
| 92.99925622908145 | 0.062 | 0.113 | -0.021 | 0.156 |
| 93.1666046857568 | 0.062 | 0.125 | -0.024 | 0.166 |
| 93.33395314243214 | 0.063 | 0.141 | -0.028 | 0.177 |
| 93.50130159910749 | 0.063 | 0.157 | -0.031 | 0.189 |
| 93.66865005578283 | 0.063 | 0.173 | -0.035 | 0.202 |
| 93.83599851245818 | 0.061 | 0.191 | -0.039 | 0.217 |
| 94.00334696913353 | 0.059 | 0.209 | -0.044 | 0.232 |
| 94.17069542580886 | 0.057 | 0.229 | -0.048 | 0.251 |
| 94.3380438824842 | 0.056 | 0.248 | -0.053 | 0.269 |
| 94.50539233915954 | 0.054 | 0.27 | -0.057 | 0.288 |
| 94.66344365935292 | 0.051 | 0.29 | -0.064 | 0.308 |
| 94.83079211602828 | 0.048 | 0.31 | -0.069 | 0.327 |
| 94.99814057270362 | 0.045 | 0.33 | -0.074 | 0.347 |
| 95.16548902937897 | 0.04 | 0.351 | -0.081 | 0.367 |
| 95.33283748605432 | 0.036 | 0.373 | -0.086 | 0.39 |
| 95.50018594272963 | 0.031 | 0.395 | -0.092 | 0.411 |
| 95.66753439940499 | 0.025 | 0.416 | -0.1 | 0.433 |
| 95.83488285608034 | 0.021 | 0.436 | -0.106 | 0.454 |
| 96.00223131275567 | 0.016 | 0.458 | -0.114 | 0.477 |
| 96.16957976943102 | 0.012 | 0.482 | -0.12 | 0.5 |
| 96.33692822610638 | 0.006 | 0.504 | -0.127 | 0.524 |
| 96.50427668278171 | 0.002 | 0.524 | -0.135 | 0.546 |
| 96.67162513945706 | -0.001 | 0.545 | -0.14 | 0.566 |
| 96.8389735961324 | -0.003 | 0.565 | -0.145 | 0.586 |
| 96.99702491632577 | -0.005 | 0.583 | -0.15 | 0.605 |
| 97.16437337300111 | -0.008 | 0.6 | -0.155 | 0.623 |
| 97.33172182967647 | -0.011 | 0.615 | -0.161 | 0.639 |
| 97.49907028635181 | -0.013 | 0.63 | -0.167 | 0.654 |
| 97.66641874302715 | -0.014 | 0.644 | -0.171 | 0.67 |
| 97.8337671997025 | -0.012 | 0.656 | -0.175 | 0.683 |
| 98.00111565637785 | -0.008 | 0.667 | -0.178 | 0.693 |
| 98.16846411305319 | -0.002 | 0.674 | -0.182 | 0.702 |
| 98.33581256972855 | 0.004 | 0.679 | -0.185 | 0.707 |
| 98.50316102640389 | 0.016 | 0.678 | -0.185 | 0.707 |
| 98.67050948307921 | 0.028 | 0.674 | -0.183 | 0.703 |
| 98.83785793975456 | 0.039 | 0.662 | -0.18 | 0.692 |
| 99.0052063964299 | 0.051 | 0.652 | -0.178 | 0.683 |
| 99.17255485310525 | 0.062 | 0.64 | -0.176 | 0.672 |
| 99.33060617329863 | 0.071 | 0.623 | -0.172 | 0.656 |
| 99.49795462997399 | 0.081 | 0.606 | -0.169 | 0.639 |
| 99.66530308664933 | 0.09 | 0.589 | -0.165 | 0.623 |
| 99.83265154332467 | 0.101 | 0.575 | -0.16 | 0.61 |
| 100.0 | 0.11 | 0.563 | -0.156 | 0.599 |